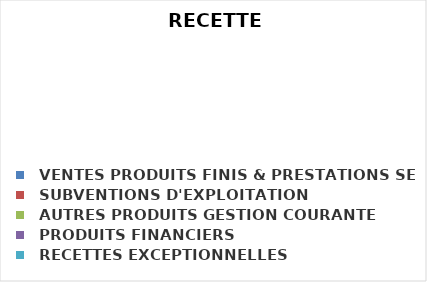
| Category | Series 0 |
|---|---|
|   VENTES PRODUITS FINIS & PRESTATIONS SERVICE | 0 |
|   SUBVENTIONS D'EXPLOITATION | 0 |
|   AUTRES PRODUITS GESTION COURANTE | 0 |
|   PRODUITS FINANCIERS | 0 |
|   RECETTES EXCEPTIONNELLES | 0 |